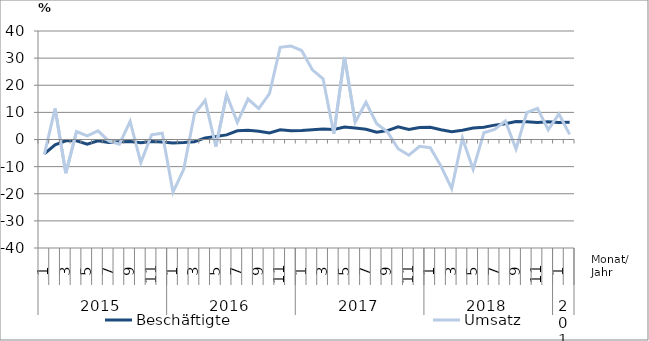
| Category | Beschäftigte | Umsatz |
|---|---|---|
| 0 | -5.3 | -5.5 |
| 1 | -2 | 11.4 |
| 2 | -0.5 | -12.4 |
| 3 | -0.5 | 2.9 |
| 4 | -1.7 | 1.3 |
| 5 | -0.5 | 3.2 |
| 6 | -1.1 | -0.5 |
| 7 | -0.8 | -1.7 |
| 8 | -0.7 | 6.7 |
| 9 | -1.2 | -8.5 |
| 10 | -0.7 | 1.7 |
| 11 | -0.9 | 2.3 |
| 12 | -1.3 | -19.4 |
| 13 | -1.1 | -11 |
| 14 | -0.8 | 9.4 |
| 15 | 0.6 | 14.4 |
| 16 | 1.1 | -2.6 |
| 17 | 1.7 | 16.5 |
| 18 | 3.2 | 6.3 |
| 19 | 3.4 | 14.9 |
| 20 | 3 | 11.4 |
| 21 | 2.4 | 16.9 |
| 22 | 3.6 | 34 |
| 23 | 3.2 | 34.5 |
| 24 | 3.3 | 32.8 |
| 25 | 3.6 | 25.7 |
| 26 | 3.9 | 22.4 |
| 27 | 3.7 | 2.1 |
| 28 | 4.6 | 30.4 |
| 29 | 4.2 | 6.4 |
| 30 | 3.8 | 13.7 |
| 31 | 2.7 | 5.8 |
| 32 | 3.3 | 2.8 |
| 33 | 4.7 | -3.4 |
| 34 | 3.7 | -5.8 |
| 35 | 4.4 | -2.5 |
| 36 | 4.5 | -3 |
| 37 | 3.6 | -9.8 |
| 38 | 2.9 | -18.1 |
| 39 | 3.4 | 0.5 |
| 40 | 4.2 | -11 |
| 41 | 4.5 | 2.5 |
| 42 | 5.3 | 3.7 |
| 43 | 5.8 | 6.8 |
| 44 | 6.6 | -3.5 |
| 45 | 6.5 | 9.9 |
| 46 | 6.3 | 11.5 |
| 47 | 6.5 | 3.6 |
| 48 | 6.3 | 9.4 |
| 49 | 6.4 | 1.9 |